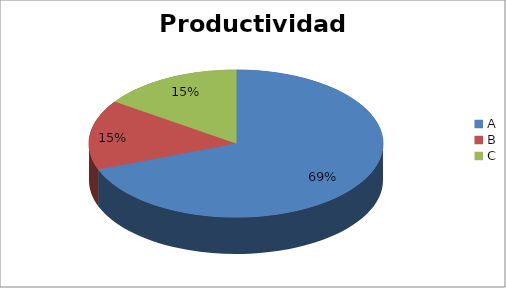
| Category | Series 0 |
|---|---|
| A | 69.231 |
| B | 15.385 |
| C | 15.385 |